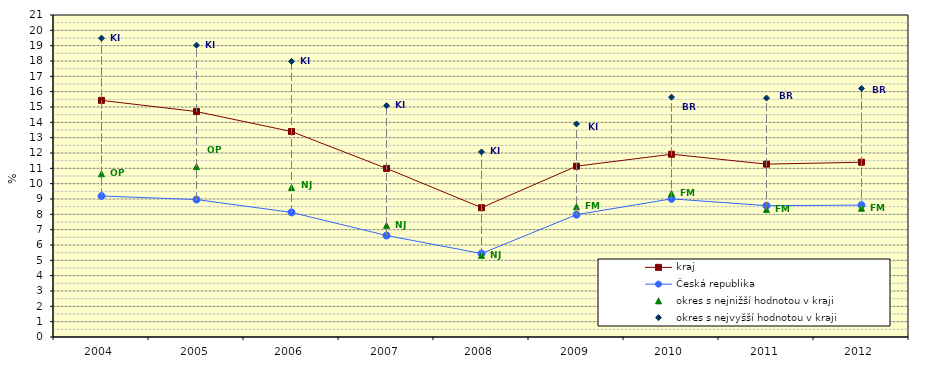
| Category | kraj | Česká republika | okres s nejnižší hodnotou v kraji | okres s nejvyšší hodnotou v kraji |
|---|---|---|---|---|
| 2004.0 | 15.432 | 9.195 | 10.648 | 19.49 |
| 2005.0 | 14.702 | 8.965 | 11.113 | 19.029 |
| 2006.0 | 13.4 | 8.126 | 9.747 | 17.975 |
| 2007.0 | 10.996 | 6.619 | 7.281 | 15.084 |
| 2008.0 | 8.433 | 5.444 | 5.328 | 12.071 |
| 2009.0 | 11.141 | 7.977 | 8.494 | 13.893 |
| 2010.0 | 11.92 | 9.009 | 9.362 | 15.645 |
| 2011.0 | 11.274 | 8.568 | 8.318 | 15.585 |
| 2012.0 | 11.399 | 8.6 | 8.4 | 16.213 |